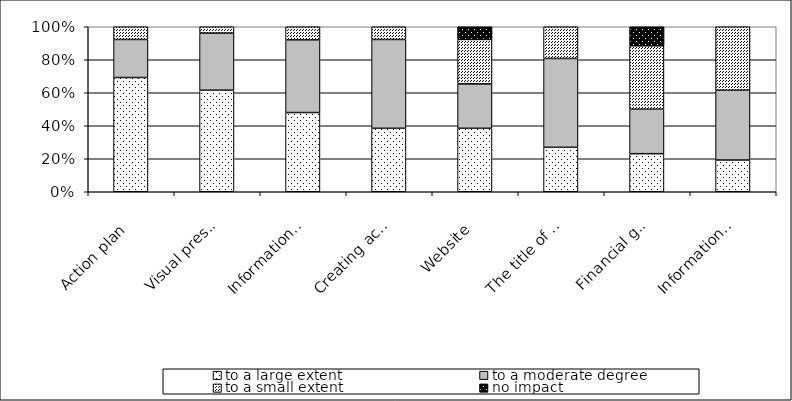
| Category | to a large extent | to a moderate degree | to a small extent | no impact |
|---|---|---|---|---|
| Action plan | 18 | 6 | 2 | 0 |
| Visual presentation | 16 | 9 | 1 | 0 |
| Information about the project | 12 | 11 | 2 | 0 |
| Creating accounts | 10 | 14 | 2 | 0 |
| Website | 10 | 7 | 7 | 2 |
| The title of the project | 7 | 14 | 5 | 0 |
| Financial goal and budget | 6 | 7 | 10 | 3 |
| Information about prizes | 5 | 11 | 10 | 0 |